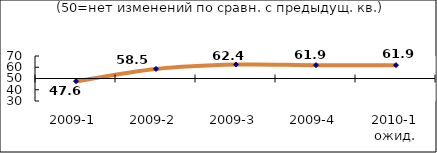
| Category | Диф.индекс ↓ |
|---|---|
| 2009-1 | 47.575 |
| 2009-2 | 58.475 |
| 2009-3 | 62.395 |
| 2009-4 | 61.865 |
| 2010-1 ожид. | 61.865 |